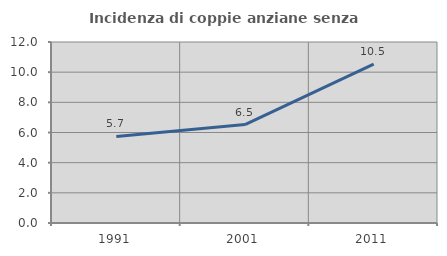
| Category | Incidenza di coppie anziane senza figli  |
|---|---|
| 1991.0 | 5.738 |
| 2001.0 | 6.528 |
| 2011.0 | 10.526 |